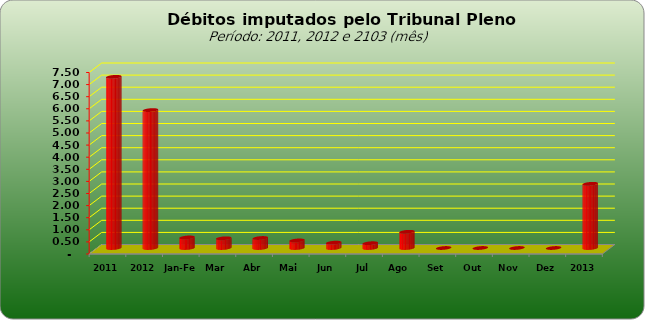
| Category |  7.073.154,74   5.698.720,25   436.112,79   401.482,76   413.229,26   313.253,71   220.510,24   197.835,92   670.047,46   -     -     -     -     2.652.472,14  |
|---|---|
| 2011 | 7073154.74 |
| 2012 | 5698720.25 |
| Jan-Fev | 436112.79 |
| Mar | 401482.76 |
| Abr | 413229.26 |
| Mai | 313253.71 |
| Jun | 220510.24 |
| Jul | 197835.92 |
| Ago | 670047.46 |
| Set | 0 |
| Out | 0 |
| Nov | 0 |
| Dez | 0 |
| 2013 | 2652472.14 |